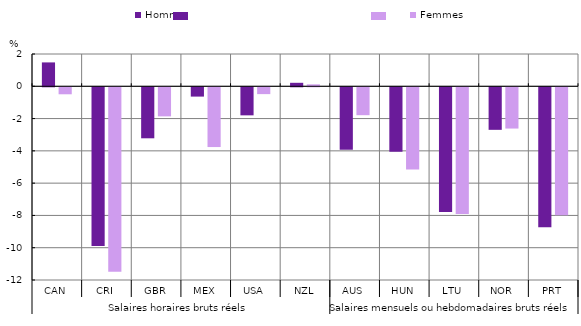
| Category | Hommes | Femmes |
|---|---|---|
| 0 | 1.479 | -0.433 |
| 1 | -9.836 | -11.427 |
| 2 | -3.16 | -1.802 |
| 3 | -0.577 | -3.702 |
| 4 | -1.738 | -0.424 |
| 5 | 0.216 | 0.12 |
| 6 | -3.869 | -1.729 |
| 7 | -3.999 | -5.095 |
| 8 | -7.731 | -7.842 |
| 9 | -2.636 | -2.556 |
| 10 | -8.669 | -7.922 |